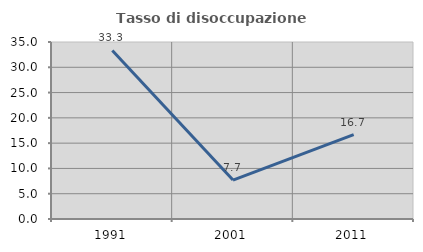
| Category | Tasso di disoccupazione giovanile  |
|---|---|
| 1991.0 | 33.333 |
| 2001.0 | 7.692 |
| 2011.0 | 16.667 |